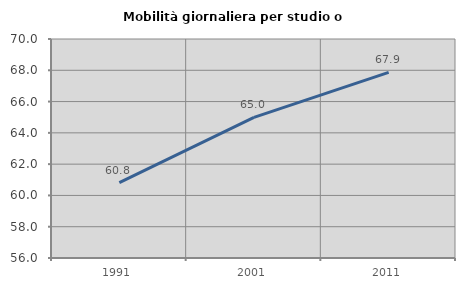
| Category | Mobilità giornaliera per studio o lavoro |
|---|---|
| 1991.0 | 60.819 |
| 2001.0 | 64.994 |
| 2011.0 | 67.865 |